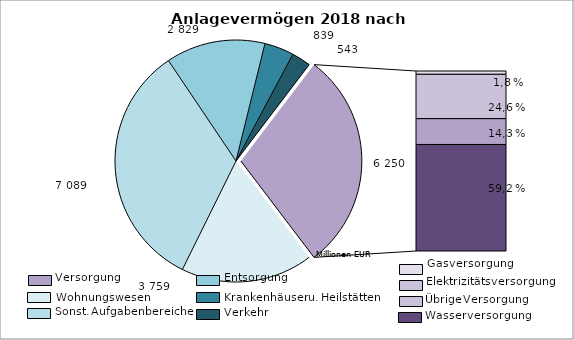
| Category | Series 0 |
|---|---|
| Wohnungsunternehmen | 3759 |
| sonstige Aufgabenbereiche | 7089 |
| Entsorgungsunternehmen | 2829 |
| Krankenhäuser | 839 |
| Verkehrsunternehmen | 543 |
| Gas | 115 |
| Elektrizität | 1540 |
| Kombinierte Unternehmen | 896 |
| Wasser | 3699 |